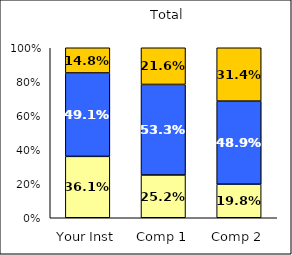
| Category | Low Job Satisfaction: Compensation | Average Job Satisfaction: Compensation | High Job Satisfaction: Compensation |
|---|---|---|---|
| Your Inst | 0.361 | 0.491 | 0.148 |
| Comp 1 | 0.252 | 0.533 | 0.216 |
| Comp 2 | 0.198 | 0.489 | 0.314 |